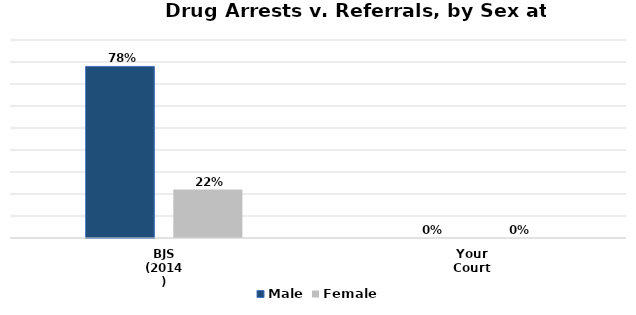
| Category | Male | Female |
|---|---|---|
| BJS
(2014) | 0.78 | 0.22 |
| Your
Court | 0 | 0 |